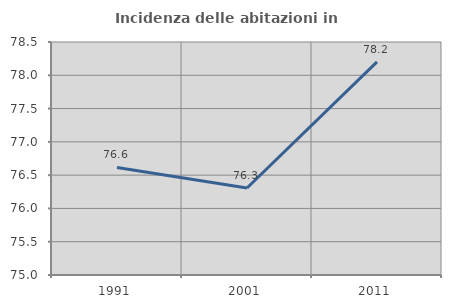
| Category | Incidenza delle abitazioni in proprietà  |
|---|---|
| 1991.0 | 76.616 |
| 2001.0 | 76.307 |
| 2011.0 | 78.201 |